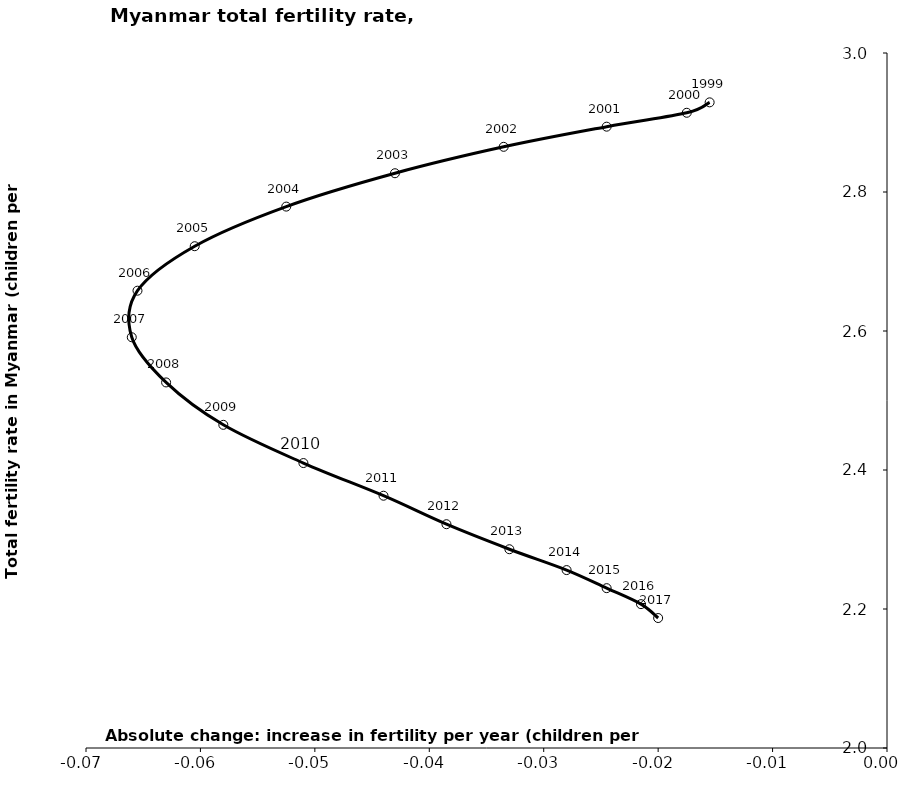
| Category | Series 0 |
|---|---|
| -0.015499999999999847 | 2.929 |
| -0.01749999999999985 | 2.914 |
| -0.024499999999999966 | 2.894 |
| -0.033500000000000085 | 2.865 |
| -0.04300000000000015 | 2.827 |
| -0.05249999999999999 | 2.779 |
| -0.0605 | 2.722 |
| -0.06549999999999989 | 2.658 |
| -0.06600000000000006 | 2.591 |
| -0.06300000000000017 | 2.526 |
| -0.05799999999999983 | 2.465 |
| -0.050999999999999934 | 2.41 |
| -0.04400000000000004 | 2.363 |
| -0.03849999999999998 | 2.322 |
| -0.03300000000000014 | 2.286 |
| -0.028000000000000025 | 2.256 |
| -0.024499999999999966 | 2.23 |
| -0.021500000000000075 | 2.207 |
| -0.020000000000000018 | 2.187 |